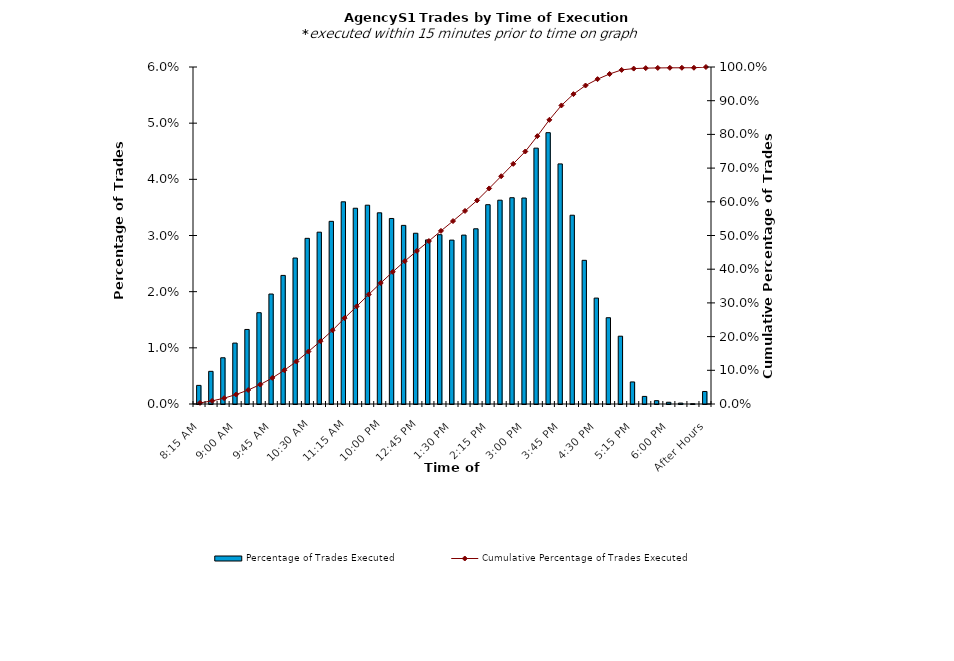
| Category | Percentage of Trades Executed |
|---|---|
| 8:15 AM | 0.003 |
| 8:30 AM | 0.006 |
| 8:45 AM | 0.008 |
| 9:00 AM | 0.011 |
| 9:15 AM | 0.013 |
| 9:30 AM | 0.016 |
| 9:45 AM | 0.02 |
| 10:00 AM | 0.023 |
| 10:15 AM | 0.026 |
| 10:30 AM | 0.029 |
| 10:45 AM | 0.031 |
| 11:00 AM | 0.033 |
| 11:15 AM | 0.036 |
| 11:30 AM | 0.035 |
| 11:45 AM | 0.035 |
| 12:00 PM | 0.034 |
| 12:15 PM | 0.033 |
| 12:30 PM | 0.032 |
| 12:45 PM | 0.03 |
| 1:00 PM | 0.029 |
| 1:15 PM | 0.03 |
| 1:30 PM | 0.029 |
| 1:45 PM | 0.03 |
| 2:00 PM | 0.031 |
| 2:15 PM | 0.035 |
| 2:30 PM | 0.036 |
| 2:45 PM | 0.037 |
| 3:00 PM | 0.037 |
| 3:15 PM | 0.046 |
| 3:30 PM | 0.048 |
| 3:45 PM | 0.043 |
| 4:00 PM | 0.034 |
| 4:15 PM | 0.026 |
| 4:30 PM | 0.019 |
| 4:45 PM | 0.015 |
| 5:00 PM | 0.012 |
| 5:15 PM | 0.004 |
| 5:30 PM | 0.001 |
| 5:45 PM | 0.001 |
| 6:00 PM | 0 |
| 6:15 PM | 0 |
| 6:30 PM | 0 |
| After Hours | 0.002 |